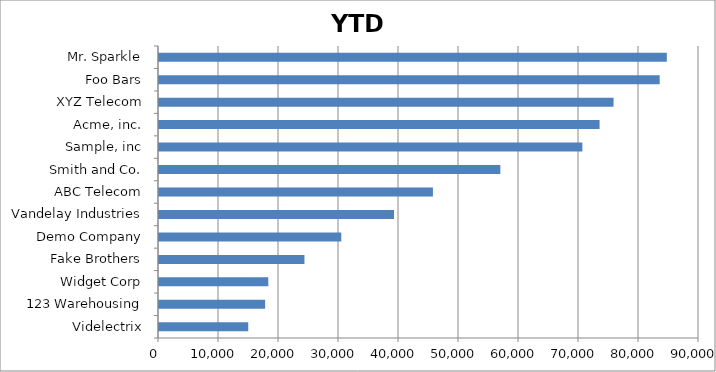
| Category | YTD SALES |
|---|---|
| Videlectrix | 14872 |
| 123 Warehousing | 17688 |
| Widget Corp | 18214 |
| Fake Brothers | 24240 |
| Demo Company | 30378 |
| Vandelay Industries | 39173 |
| ABC Telecom | 45656 |
| Smith and Co. | 56893 |
| Sample, inc | 70558 |
| Acme, inc. | 73428 |
| XYZ Telecom | 75761 |
| Foo Bars | 83446 |
| Mr. Sparkle | 84637 |